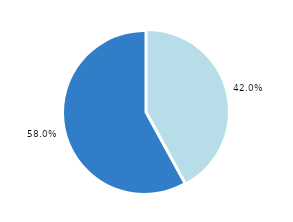
| Category | Series 0 |
|---|---|
| 0 | 4041 |
| 1 | 5573 |